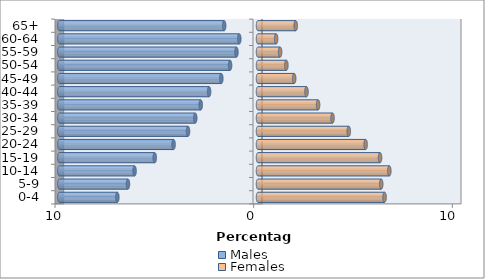
| Category | Males | Females |
|---|---|---|
| 0-4 | -7.08 | 6.371 |
| 5-9 | -6.546 | 6.202 |
| 10-14 | -6.213 | 6.61 |
| 15-19 | -5.197 | 6.143 |
| 20-24 | -4.25 | 5.418 |
| 25-29 | -3.523 | 4.569 |
| 30-34 | -3.16 | 3.751 |
| 35-39 | -2.883 | 3.025 |
| 40-44 | -2.461 | 2.441 |
| 45-49 | -1.847 | 1.822 |
| 50-54 | -1.405 | 1.428 |
| 55-59 | -1.085 | 1.112 |
| 60-64 | -0.942 | 0.913 |
| 65+ | -1.703 | 1.9 |